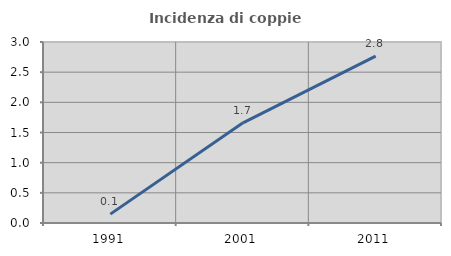
| Category | Incidenza di coppie miste |
|---|---|
| 1991.0 | 0.147 |
| 2001.0 | 1.661 |
| 2011.0 | 2.767 |